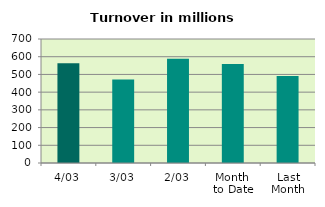
| Category | Series 0 |
|---|---|
| 4/03 | 563.376 |
| 3/03 | 470.841 |
| 2/03 | 587.938 |
| Month 
to Date | 558.862 |
| Last
Month | 490.433 |